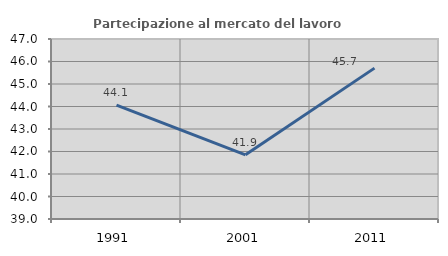
| Category | Partecipazione al mercato del lavoro  femminile |
|---|---|
| 1991.0 | 44.064 |
| 2001.0 | 41.852 |
| 2011.0 | 45.705 |